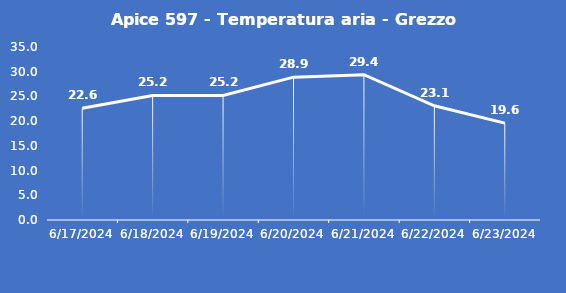
| Category | Apice 597 - Temperatura aria - Grezzo (°C) |
|---|---|
| 6/17/24 | 22.6 |
| 6/18/24 | 25.2 |
| 6/19/24 | 25.2 |
| 6/20/24 | 28.9 |
| 6/21/24 | 29.4 |
| 6/22/24 | 23.1 |
| 6/23/24 | 19.6 |